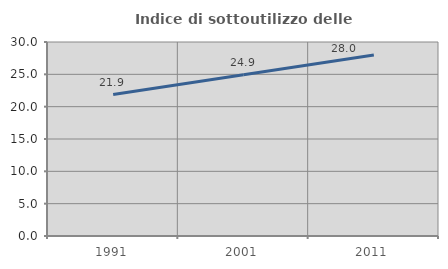
| Category | Indice di sottoutilizzo delle abitazioni  |
|---|---|
| 1991.0 | 21.87 |
| 2001.0 | 24.946 |
| 2011.0 | 27.974 |